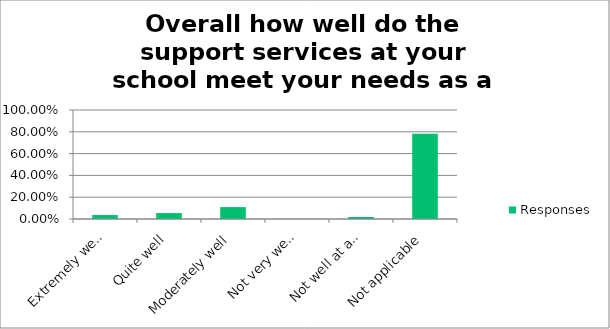
| Category | Responses |
|---|---|
| Extremely well | 0.036 |
| Quite well | 0.054 |
| Moderately well | 0.109 |
| Not very well | 0 |
| Not well at all | 0.018 |
| Not applicable | 0.782 |